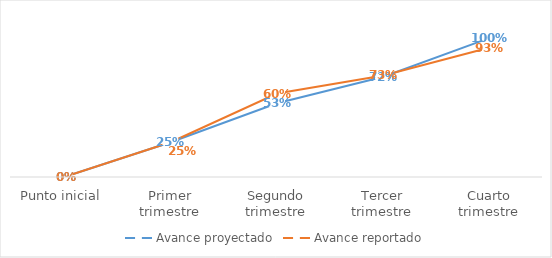
| Category | Avance proyectado | Avance reportado |
|---|---|---|
| Punto inicial | 0 | 0 |
| Primer trimestre | 0.25 | 0.25 |
| Segundo trimestre | 0.53 | 0.6 |
| Tercer trimestre | 0.72 | 0.73 |
| Cuarto trimestre | 1 | 0.93 |